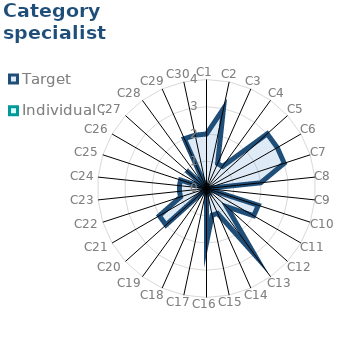
| Category | Target | Individual 2 |
|---|---|---|
| C1 | 2 | 0 |
| C2 | 3 | 0 |
| C3 | 1 | 0 |
| C4 | 1 | 0 |
| C5 | 3 | 0 |
| C6 | 3 | 0 |
| C7 | 3 | 0 |
| C8 | 2 | 0 |
| C9 | 0 | 0 |
| C10 | 2 | 0 |
| C11 | 2 | 0 |
| C12 | 1 | 0 |
| C13 | 3 | 0 |
| C14 | 1 | 0 |
| C15 | 1 | 0 |
| C16 | 2 | 0 |
| C17 | 0 | 0 |
| C18 | 0 | 0 |
| C19 | 0 | 0 |
| C20 | 2 | 0 |
| C21 | 2 | 0 |
| C22 | 1 | 0 |
| C23 | 1 | 0 |
| C24 | 1 | 0 |
| C25 | 1 | 0 |
| C26 | 0 | 0 |
| C27 | 1 | 0 |
| C28 | 0 | 0 |
| C29 | 2 | 0 |
| C30 | 2 | 0 |